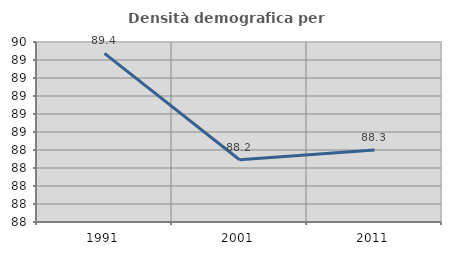
| Category | Densità demografica |
|---|---|
| 1991.0 | 89.374 |
| 2001.0 | 88.192 |
| 2011.0 | 88.299 |